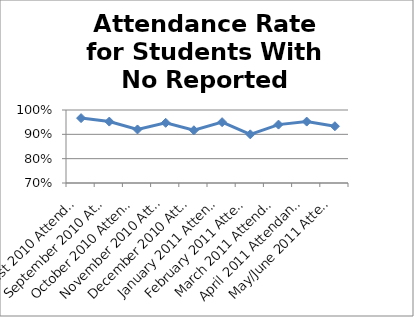
| Category | Attendance Rate for Students With No Reported Ethnicity |
|---|---|
| August 2010 Attendance Rate | 0.967 |
| September 2010 Attendance Rate | 0.952 |
| October 2010 Attendance Rate | 0.92 |
| November 2010 Attendance Rate | 0.947 |
| December 2010 Attendance Rate | 0.917 |
| January 2011 Attendance Rate | 0.95 |
| February 2011 Attendance Rate | 0.9 |
| March 2011 Attendance Rate | 0.94 |
| April 2011 Attendance Rate | 0.952 |
| May/June 2011 Attendance Rate | 0.933 |